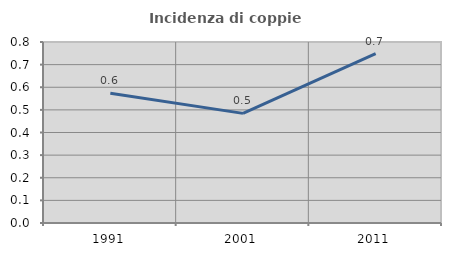
| Category | Incidenza di coppie miste |
|---|---|
| 1991.0 | 0.574 |
| 2001.0 | 0.484 |
| 2011.0 | 0.749 |